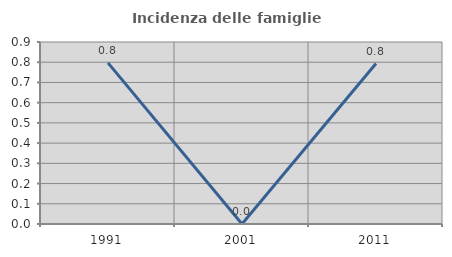
| Category | Incidenza delle famiglie numerose |
|---|---|
| 1991.0 | 0.797 |
| 2001.0 | 0 |
| 2011.0 | 0.794 |